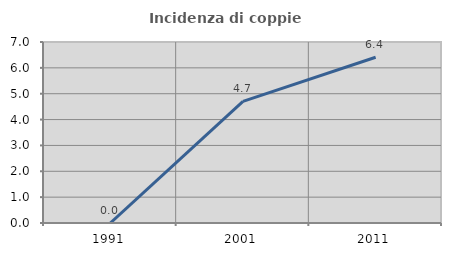
| Category | Incidenza di coppie miste |
|---|---|
| 1991.0 | 0 |
| 2001.0 | 4.706 |
| 2011.0 | 6.41 |